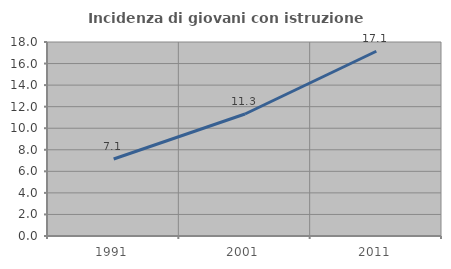
| Category | Incidenza di giovani con istruzione universitaria |
|---|---|
| 1991.0 | 7.143 |
| 2001.0 | 11.321 |
| 2011.0 | 17.143 |